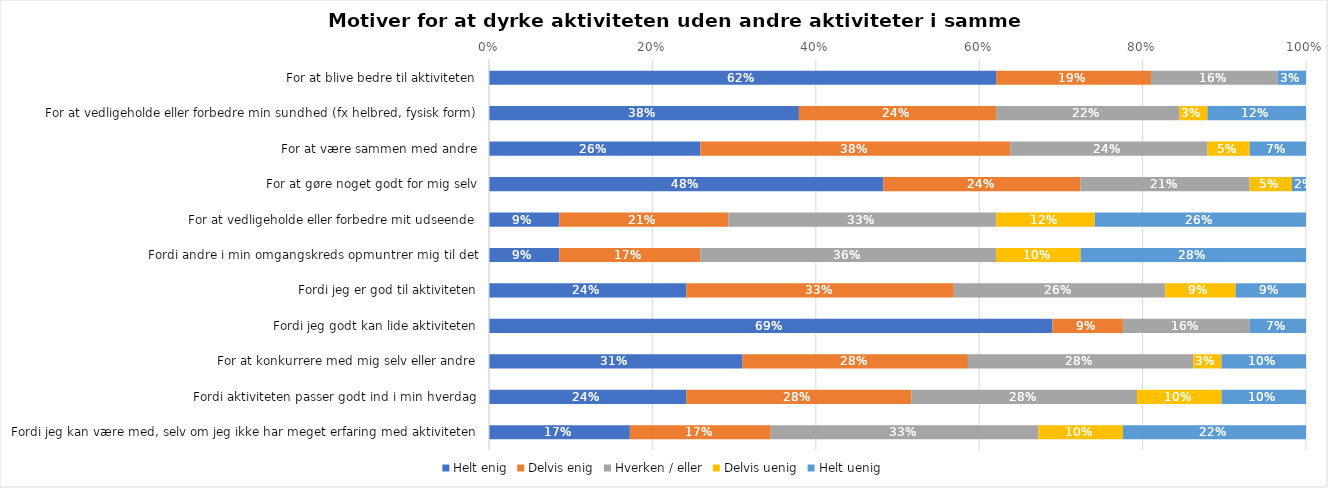
| Category | Helt enig | Delvis enig | Hverken / eller | Delvis uenig | Helt uenig |
|---|---|---|---|---|---|
| For at blive bedre til aktiviteten | 0.621 | 0.19 | 0.155 | 0 | 0.034 |
| For at vedligeholde eller forbedre min sundhed (fx helbred, fysisk form) | 0.379 | 0.241 | 0.224 | 0.034 | 0.121 |
| For at være sammen med andre | 0.259 | 0.379 | 0.241 | 0.052 | 0.069 |
| For at gøre noget godt for mig selv | 0.483 | 0.241 | 0.207 | 0.052 | 0.017 |
| For at vedligeholde eller forbedre mit udseende | 0.086 | 0.207 | 0.328 | 0.121 | 0.259 |
| Fordi andre i min omgangskreds opmuntrer mig til det | 0.086 | 0.172 | 0.362 | 0.103 | 0.276 |
| Fordi jeg er god til aktiviteten | 0.241 | 0.328 | 0.259 | 0.086 | 0.086 |
| Fordi jeg godt kan lide aktiviteten | 0.69 | 0.086 | 0.155 | 0 | 0.069 |
| For at konkurrere med mig selv eller andre | 0.31 | 0.276 | 0.276 | 0.034 | 0.103 |
| Fordi aktiviteten passer godt ind i min hverdag | 0.241 | 0.276 | 0.276 | 0.103 | 0.103 |
| Fordi jeg kan være med, selv om jeg ikke har meget erfaring med aktiviteten | 0.172 | 0.172 | 0.328 | 0.103 | 0.224 |